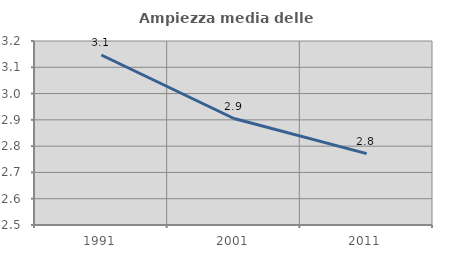
| Category | Ampiezza media delle famiglie |
|---|---|
| 1991.0 | 3.147 |
| 2001.0 | 2.905 |
| 2011.0 | 2.772 |